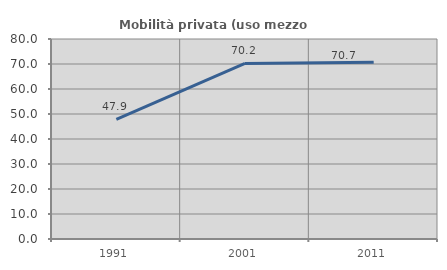
| Category | Mobilità privata (uso mezzo privato) |
|---|---|
| 1991.0 | 47.863 |
| 2001.0 | 70.229 |
| 2011.0 | 70.745 |